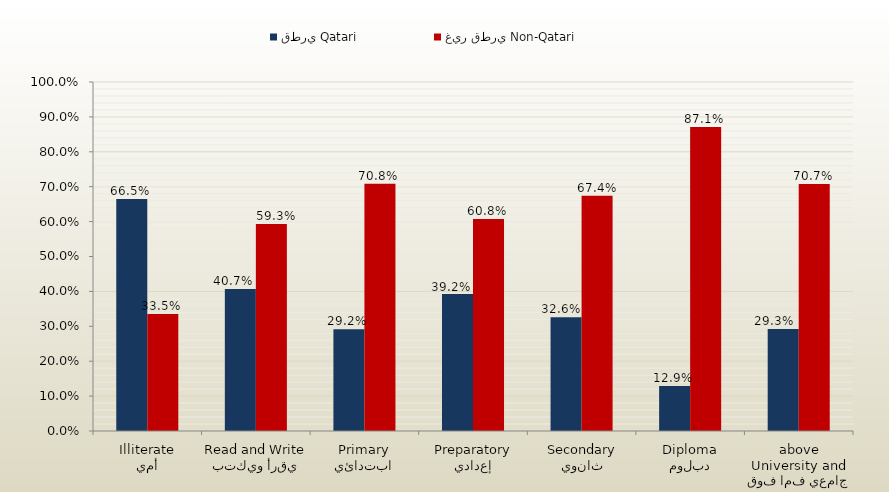
| Category | قطري Qatari | غير قطري Non-Qatari |
|---|---|---|
| أمي
Illiterate | 0.665 | 0.335 |
| يقرأ ويكتب
Read and Write | 0.407 | 0.593 |
| ابتدائي
Primary | 0.292 | 0.708 |
| إعدادي
Preparatory | 0.392 | 0.608 |
| ثانوي
Secondary | 0.326 | 0.674 |
| دبلوم
Diploma | 0.129 | 0.871 |
| جامعي فما فوق
University and above | 0.293 | 0.707 |